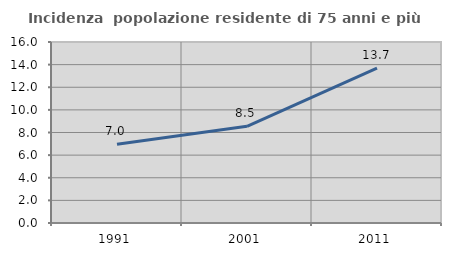
| Category | Incidenza  popolazione residente di 75 anni e più |
|---|---|
| 1991.0 | 6.965 |
| 2001.0 | 8.549 |
| 2011.0 | 13.698 |